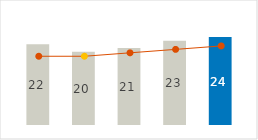
| Category | Freight & Forwarding |
|---|---|
| 0 | 22 |
| 1 | 20 |
| 2 | 21 |
| 3 | 23 |
| 4 | 24 |